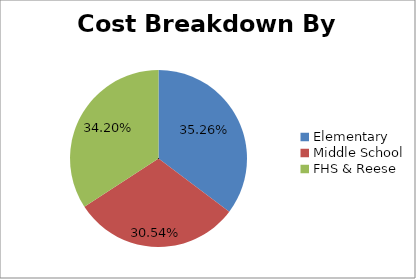
| Category | Cost Breakdown By Level |
|---|---|
| Elementary | 0.353 |
| Middle School | 0.305 |
| FHS & Reese | 0.342 |